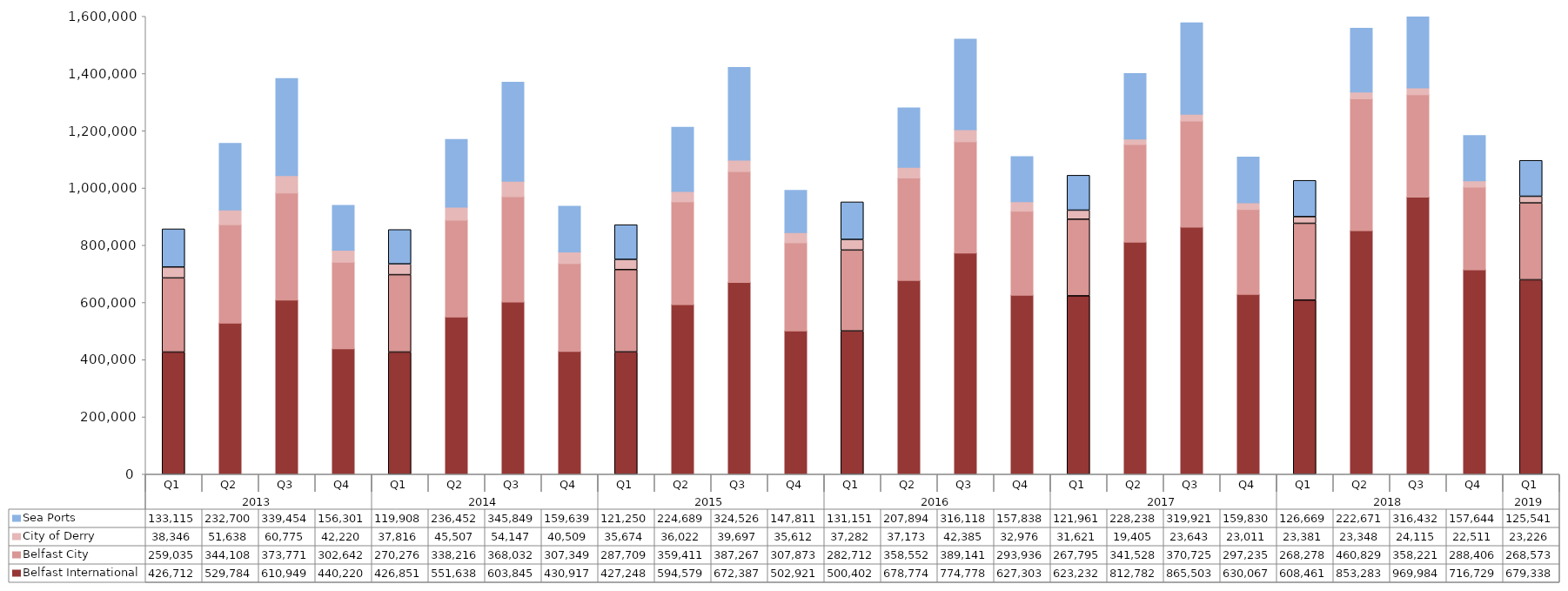
| Category | Belfast International  | Belfast City  | City of Derry | Sea Ports  |
|---|---|---|---|---|
| 0 | 426712 | 259035 | 38346 | 133115 |
| 1 | 529784 | 344108 | 51638 | 232700 |
| 2 | 610949 | 373771 | 60775 | 339454 |
| 3 | 440220 | 302642 | 42220 | 156301 |
| 4 | 426851 | 270276 | 37816 | 119908 |
| 5 | 551638 | 338216 | 45507 | 236452 |
| 6 | 603845 | 368032 | 54147 | 345849 |
| 7 | 430917 | 307349 | 40509 | 159639 |
| 8 | 427248 | 287709 | 35674 | 121250 |
| 9 | 594579 | 359411 | 36022 | 224689 |
| 10 | 672387 | 387267 | 39697 | 324526 |
| 11 | 502921 | 307873 | 35612 | 147811 |
| 12 | 500402 | 282712 | 37282 | 131151 |
| 13 | 678774 | 358552 | 37173 | 207894 |
| 14 | 774778 | 389141 | 42385 | 316118 |
| 15 | 627303 | 293936 | 32976 | 157838 |
| 16 | 623232 | 267795 | 31621 | 121961 |
| 17 | 812782 | 341528 | 19405 | 228238 |
| 18 | 865503 | 370725 | 23643 | 319921 |
| 19 | 630067 | 297235 | 23011 | 159830 |
| 20 | 608461 | 268278 | 23381 | 126669 |
| 21 | 853283 | 460829 | 23348 | 222671 |
| 22 | 969984 | 358221 | 24115 | 316432 |
| 23 | 716729 | 288406 | 22511 | 157644 |
| 24 | 679338 | 268573 | 23226 | 125541 |